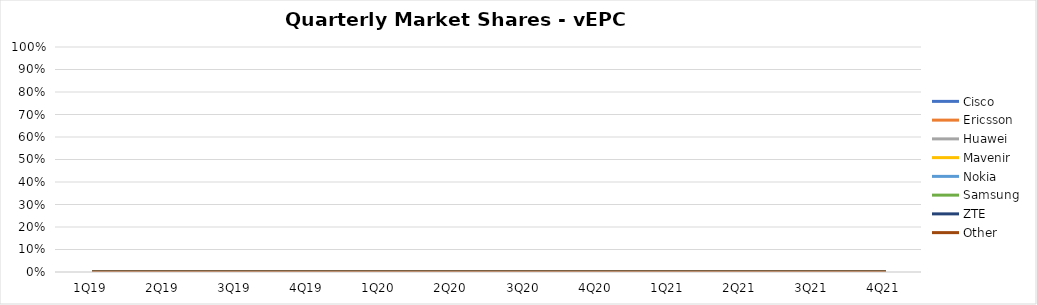
| Category | Cisco | Ericsson | Huawei | Mavenir | Nokia | Samsung | ZTE | Other |
|---|---|---|---|---|---|---|---|---|
| 1Q19 | 0 | 0 | 0 | 0 | 0 | 0 | 0 | 0 |
| 2Q19 | 0 | 0 | 0 | 0 | 0 | 0 | 0 | 0 |
| 3Q19 | 0 | 0 | 0 | 0 | 0 | 0 | 0 | 0 |
| 4Q19 | 0 | 0 | 0 | 0 | 0 | 0 | 0 | 0 |
| 1Q20 | 0 | 0 | 0 | 0 | 0 | 0 | 0 | 0 |
| 2Q20 | 0 | 0 | 0 | 0 | 0 | 0 | 0 | 0 |
| 3Q20 | 0 | 0 | 0 | 0 | 0 | 0 | 0 | 0 |
| 4Q20 | 0 | 0 | 0 | 0 | 0 | 0 | 0 | 0 |
| 1Q21 | 0 | 0 | 0 | 0 | 0 | 0 | 0 | 0 |
| 2Q21 | 0 | 0 | 0 | 0 | 0 | 0 | 0 | 0 |
| 3Q21 | 0 | 0 | 0 | 0 | 0 | 0 | 0 | 0 |
| 4Q21 | 0 | 0 | 0 | 0 | 0 | 0 | 0 | 0 |